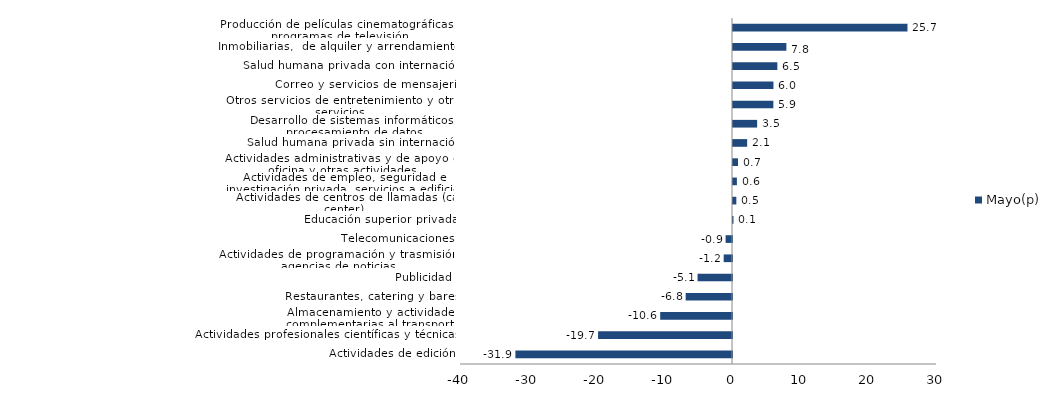
| Category | Mayo(p) |
|---|---|
| Actividades de edición | -31.853 |
| Actividades profesionales científicas y técnicas  | -19.697 |
| Almacenamiento y actividades complementarias al transporte | -10.559 |
| Restaurantes, catering y bares | -6.812 |
| Publicidad | -5.063 |
| Actividades de programación y trasmisión,  agencias de noticias | -1.224 |
| Telecomunicaciones | -0.943 |
| Educación superior privada | 0.073 |
| Actividades de centros de llamadas (call center) | 0.492 |
| Actividades de empleo, seguridad e investigación privada, servicios a edificios | 0.572 |
| Actividades administrativas y de apoyo de oficina y otras actividades | 0.733 |
| Salud humana privada sin internación | 2.081 |
| Desarrollo de sistemas informáticos y procesamiento de datos | 3.55 |
| Otros servicios de entretenimiento y otros servicios | 5.937 |
| Correo y servicios de mensajería | 5.951 |
| Salud humana privada con internación | 6.522 |
| Inmobiliarias,  de alquiler y arrendamiento  | 7.849 |
| Producción de películas cinematográficas y programas de televisión | 25.659 |